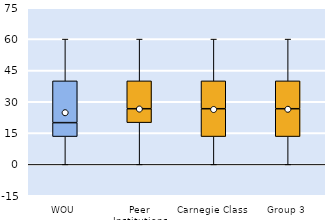
| Category | 25th | 50th | 75th |
|---|---|---|---|
| WOU | 13.333 | 6.667 | 20 |
| Peer Institutions | 20 | 6.667 | 13.333 |
| Carnegie Class | 13.333 | 13.333 | 13.333 |
| Group 3 | 13.333 | 13.333 | 13.333 |